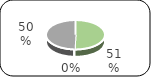
| Category | Series 0 |
|---|---|
| 0 | 404 |
| 1 | 0 |
| 2 | 396 |